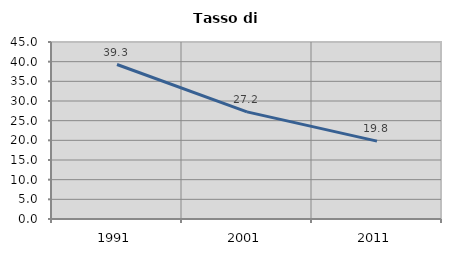
| Category | Tasso di disoccupazione   |
|---|---|
| 1991.0 | 39.278 |
| 2001.0 | 27.228 |
| 2011.0 | 19.792 |